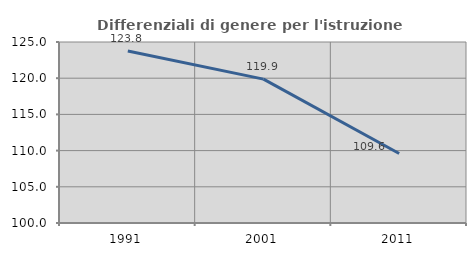
| Category | Differenziali di genere per l'istruzione superiore |
|---|---|
| 1991.0 | 123.766 |
| 2001.0 | 119.873 |
| 2011.0 | 109.592 |